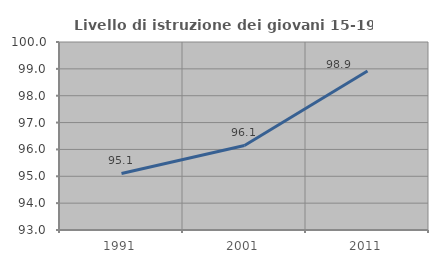
| Category | Livello di istruzione dei giovani 15-19 anni |
|---|---|
| 1991.0 | 95.106 |
| 2001.0 | 96.147 |
| 2011.0 | 98.917 |